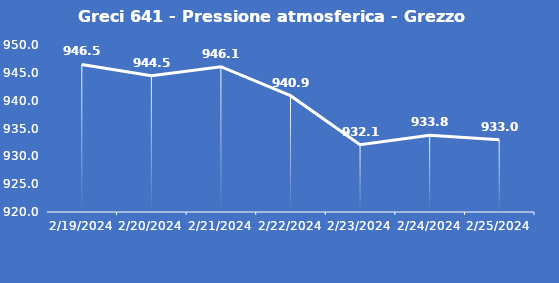
| Category | Greci 641 - Pressione atmosferica - Grezzo (hPa) |
|---|---|
| 2/19/24 | 946.5 |
| 2/20/24 | 944.5 |
| 2/21/24 | 946.1 |
| 2/22/24 | 940.9 |
| 2/23/24 | 932.1 |
| 2/24/24 | 933.8 |
| 2/25/24 | 933 |